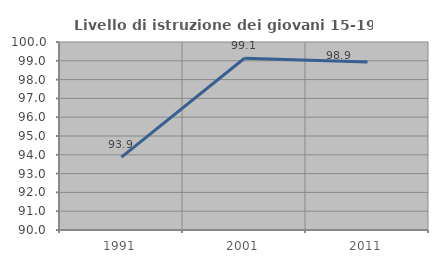
| Category | Livello di istruzione dei giovani 15-19 anni |
|---|---|
| 1991.0 | 93.878 |
| 2001.0 | 99.138 |
| 2011.0 | 98.936 |